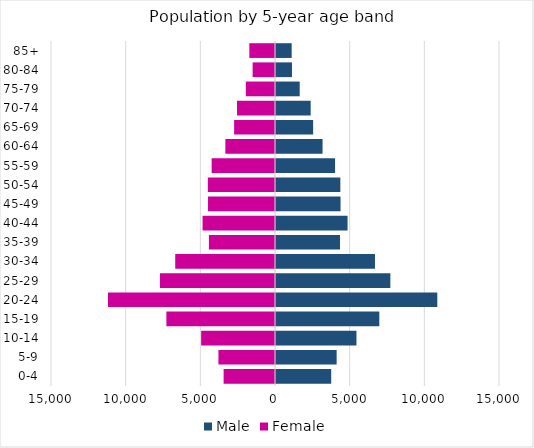
| Category | Male | Female |
|---|---|---|
| 0-4 | 3696 | -3441 |
| 5-9 | 4061 | -3788 |
| 10-14 | 5388 | -4945 |
| 15-19 | 6918 | -7273 |
| 20-24 | 10802 | -11184 |
| 25-29 | 7658 | -7704 |
| 30-34 | 6628 | -6681 |
| 35-39 | 4285 | -4426 |
| 40-44 | 4792 | -4851 |
| 45-49 | 4322 | -4485 |
| 50-54 | 4309 | -4498 |
| 55-59 | 3955 | -4244 |
| 60-64 | 3119 | -3324 |
| 65-69 | 2487 | -2737 |
| 70-74 | 2322 | -2543 |
| 75-79 | 1588 | -1955 |
| 80-84 | 1069 | -1499 |
| 85+ | 1050 | -1719 |